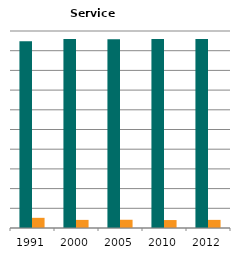
| Category | Male | Female |
|---|---|---|
| 1991.0 | 0.948 | 0.052 |
| 2000.0 | 0.959 | 0.041 |
| 2005.0 | 0.958 | 0.042 |
| 2010.0 | 0.96 | 0.04 |
| 2012.0 | 0.959 | 0.041 |